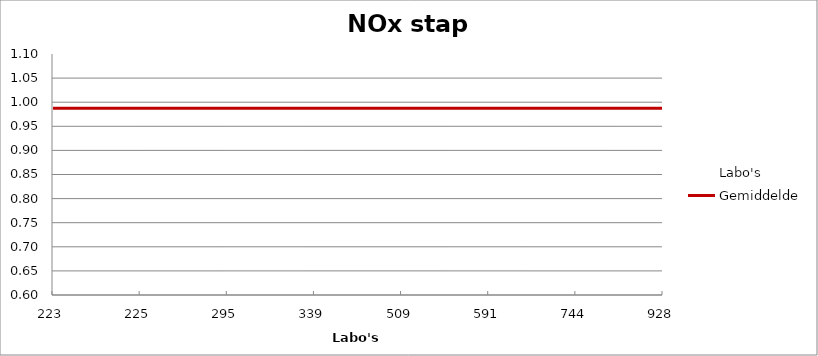
| Category | Labo's | Gemiddelde |
|---|---|---|
| 223.0 | 0.923 | 0.988 |
| 225.0 | 0.621 | 0.988 |
| 295.0 | 1.012 | 0.988 |
| 339.0 | 1.023 | 0.988 |
| 509.0 | 1.007 | 0.988 |
| 591.0 | 0.984 | 0.988 |
| 744.0 | 1.012 | 0.988 |
| 928.0 | 1.029 | 0.988 |